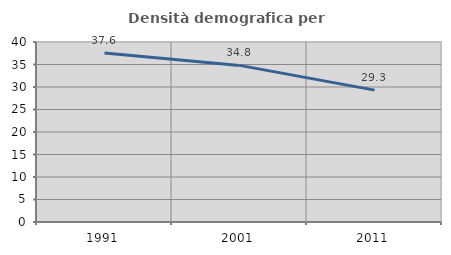
| Category | Densità demografica |
|---|---|
| 1991.0 | 37.552 |
| 2001.0 | 34.804 |
| 2011.0 | 29.309 |